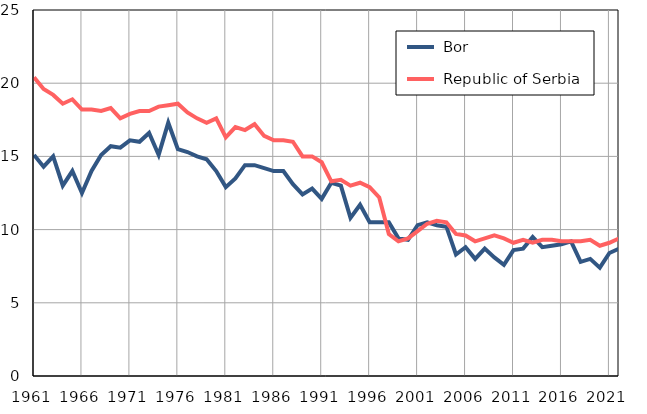
| Category |  Bor |  Republic of Serbia |
|---|---|---|
| 1961.0 | 15.1 | 20.4 |
| 1962.0 | 14.3 | 19.6 |
| 1963.0 | 15 | 19.2 |
| 1964.0 | 13 | 18.6 |
| 1965.0 | 14 | 18.9 |
| 1966.0 | 12.5 | 18.2 |
| 1967.0 | 14 | 18.2 |
| 1968.0 | 15.1 | 18.1 |
| 1969.0 | 15.7 | 18.3 |
| 1970.0 | 15.6 | 17.6 |
| 1971.0 | 16.1 | 17.9 |
| 1972.0 | 16 | 18.1 |
| 1973.0 | 16.6 | 18.1 |
| 1974.0 | 15.1 | 18.4 |
| 1975.0 | 17.3 | 18.5 |
| 1976.0 | 15.5 | 18.6 |
| 1977.0 | 15.3 | 18 |
| 1978.0 | 15 | 17.6 |
| 1979.0 | 14.8 | 17.3 |
| 1980.0 | 14 | 17.6 |
| 1981.0 | 12.9 | 16.3 |
| 1982.0 | 13.5 | 17 |
| 1983.0 | 14.4 | 16.8 |
| 1984.0 | 14.4 | 17.2 |
| 1985.0 | 14.2 | 16.4 |
| 1986.0 | 14 | 16.1 |
| 1987.0 | 14 | 16.1 |
| 1988.0 | 13.1 | 16 |
| 1989.0 | 12.4 | 15 |
| 1990.0 | 12.8 | 15 |
| 1991.0 | 12.1 | 14.6 |
| 1992.0 | 13.2 | 13.3 |
| 1993.0 | 13 | 13.4 |
| 1994.0 | 10.8 | 13 |
| 1995.0 | 11.7 | 13.2 |
| 1996.0 | 10.5 | 12.9 |
| 1997.0 | 10.5 | 12.2 |
| 1998.0 | 10.5 | 9.7 |
| 1999.0 | 9.4 | 9.2 |
| 2000.0 | 9.3 | 9.4 |
| 2001.0 | 10.3 | 9.9 |
| 2002.0 | 10.5 | 10.4 |
| 2003.0 | 10.3 | 10.6 |
| 2004.0 | 10.2 | 10.5 |
| 2005.0 | 8.3 | 9.7 |
| 2006.0 | 8.8 | 9.6 |
| 2007.0 | 8 | 9.2 |
| 2008.0 | 8.7 | 9.4 |
| 2009.0 | 8.1 | 9.6 |
| 2010.0 | 7.6 | 9.4 |
| 2011.0 | 8.6 | 9.1 |
| 2012.0 | 8.7 | 9.3 |
| 2013.0 | 9.5 | 9.1 |
| 2014.0 | 8.8 | 9.3 |
| 2015.0 | 8.9 | 9.3 |
| 2016.0 | 9 | 9.2 |
| 2017.0 | 9.2 | 9.2 |
| 2018.0 | 7.8 | 9.2 |
| 2019.0 | 8 | 9.3 |
| 2020.0 | 7.4 | 8.9 |
| 2021.0 | 8.4 | 9.1 |
| 2022.0 | 8.7 | 9.4 |